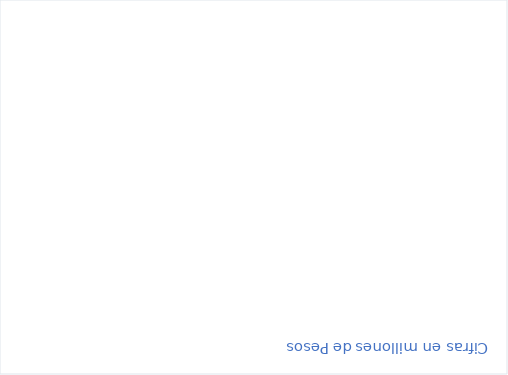
| Category | RESERVAS CONSTITUIDAS
 | CANCELACIONES RESERVAS PRESUPUESTALES
  | PAGOS
ACUMULADOS
 |
|---|---|---|---|
| Total | 55446.915 | 1008.219 | 43766.224 |